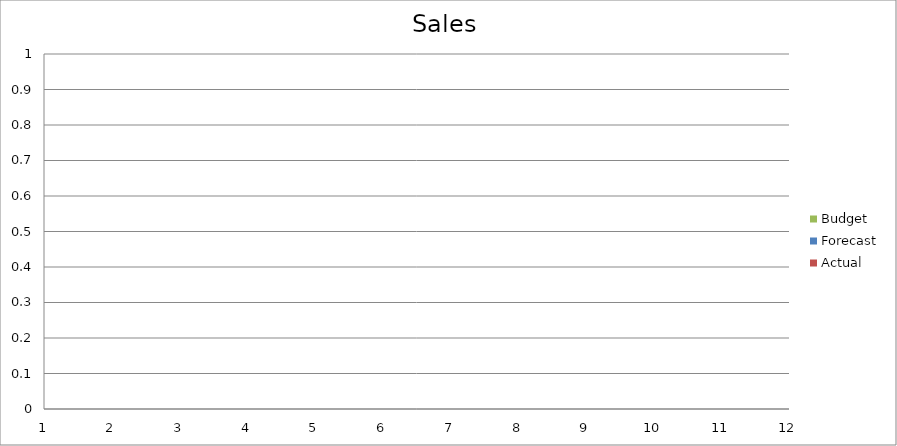
| Category | Budget | Forecast | Actual |
|---|---|---|---|
| 0 | 3350 | 1270 | 3490 |
| 1 | 3430 | 1530 | 1870 |
| 2 | 2530 | 1300 | 780 |
| 3 | 3080 | 1410 | 1890 |
| 4 | 1660 | 610 | 1120 |
| 5 | 740 | 2990 | 1700 |
| 6 | 3430 | 1760 | 1100 |
| 7 | 1770 | 3130 | 1370 |
| 8 | 2460 | 1290 | 2860 |
| 9 | 2780 | 2140 | 1710 |
| 10 | 1850 | 2800 | 1520 |
| 11 | 1150 | 3200 | 520 |